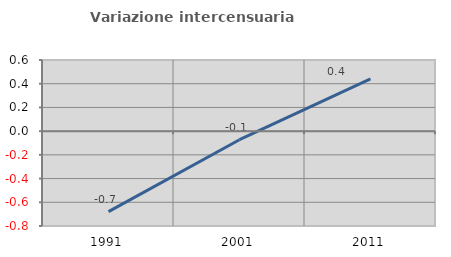
| Category | Variazione intercensuaria annua |
|---|---|
| 1991.0 | -0.679 |
| 2001.0 | -0.072 |
| 2011.0 | 0.44 |